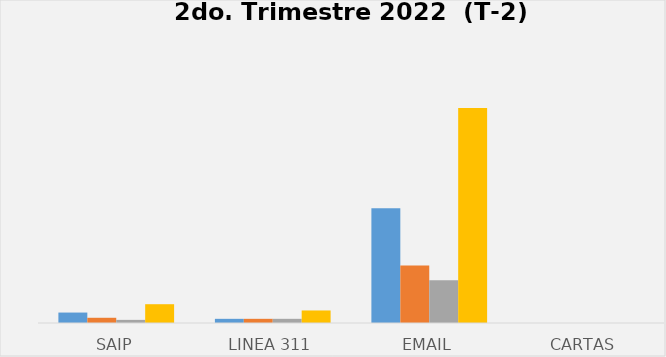
| Category | Series 0 | Series 1 | Series 2 | Series 3 |
|---|---|---|---|---|
| SAIP | 10 | 5 | 3 | 18 |
| Linea 311 | 4 | 4 | 4 | 12 |
| Email | 110 | 55 | 41 | 206 |
| Cartas | 0 | 0 | 0 | 0 |